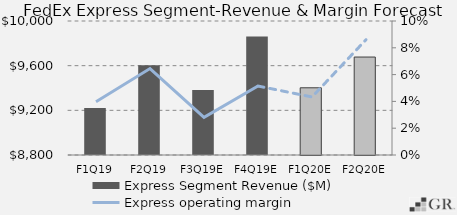
| Category | Express Segment Revenue ($M) |
|---|---|
|  F1Q19  | 9221.298 |
|  F2Q19  | 9603.601 |
|  F3Q19E  | 9381.728 |
|  F4Q19E  | 9860.232 |
|  F1Q20E  | 9401.901 |
|  F2Q20E  | 9677.226 |